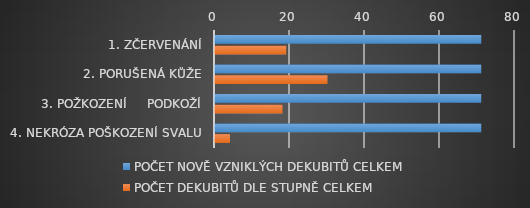
| Category | POČET NOVĚ VZNIKLÝCH DEKUBITŮ CELKEM | POČET DEKUBITŮ DLE STUPNĚ CELKEM |
|---|---|---|
| 1. ZČERVENÁNÍ | 71 | 19 |
| 2. PORUŠENÁ KŮŽE | 71 | 30 |
| 3. POŽKOZENÍ     PODKOŽÍ | 71 | 18 |
| 4. NEKRÓZA POŠKOZENÍ SVALU | 71 | 4 |